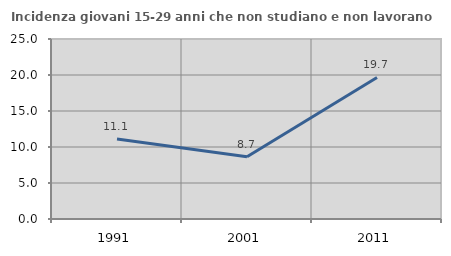
| Category | Incidenza giovani 15-29 anni che non studiano e non lavorano  |
|---|---|
| 1991.0 | 11.125 |
| 2001.0 | 8.654 |
| 2011.0 | 19.663 |